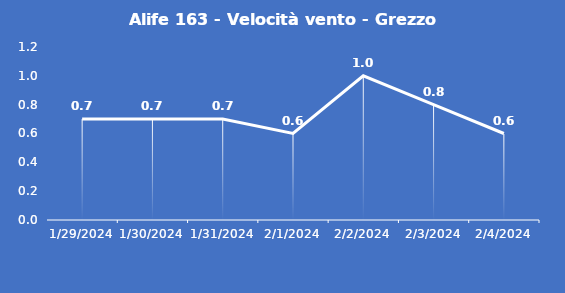
| Category | Alife 163 - Velocità vento - Grezzo (m/s) |
|---|---|
| 1/29/24 | 0.7 |
| 1/30/24 | 0.7 |
| 1/31/24 | 0.7 |
| 2/1/24 | 0.6 |
| 2/2/24 | 1 |
| 2/3/24 | 0.8 |
| 2/4/24 | 0.6 |